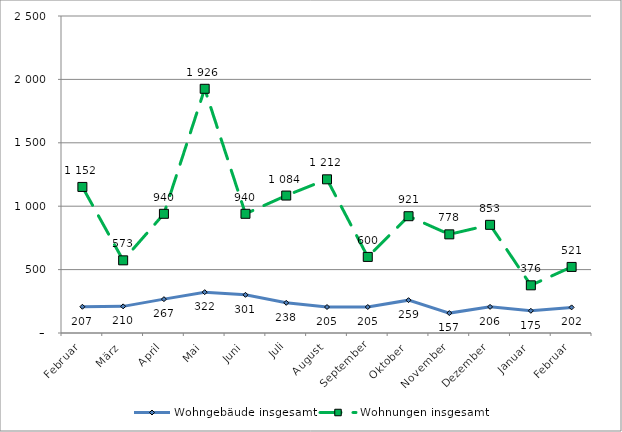
| Category | Wohngebäude insgesamt | Wohnungen insgesamt |
|---|---|---|
| Februar | 207 | 1152 |
| März | 210 | 573 |
| April | 267 | 940 |
| Mai | 322 | 1926 |
| Juni | 301 | 940 |
| Juli | 238 | 1084 |
| August | 205 | 1212 |
| September | 205 | 600 |
| Oktober | 259 | 921 |
| November | 157 | 778 |
| Dezember | 206 | 853 |
| Januar | 175 | 376 |
| Februar | 202 | 521 |